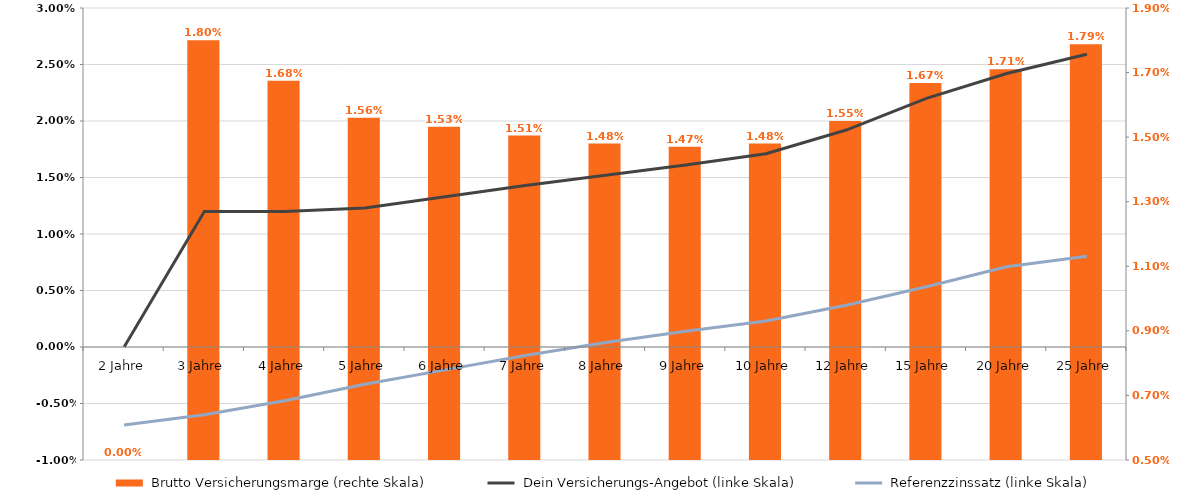
| Category |  Brutto Versicherungsmarge (rechte Skala) |
|---|---|
| 2 Jahre | 0 |
| 3 Jahre | 0.018 |
| 4 Jahre | 0.017 |
| 5 Jahre | 0.016 |
| 6 Jahre | 0.015 |
| 7 Jahre | 0.015 |
| 8 Jahre | 0.015 |
| 9 Jahre | 0.015 |
| 10 Jahre | 0.015 |
|  12 Jahre  | 0.016 |
|  15 Jahre  | 0.017 |
|  20 Jahre  | 0.017 |
|  25 Jahre  | 0.018 |